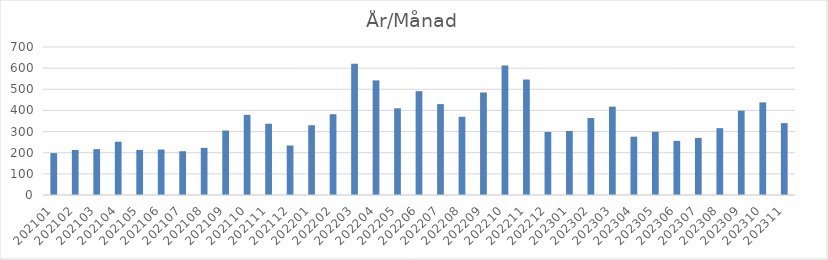
| Category | Summa |
|---|---|
| 202101 | 198 |
| 202102 | 213 |
| 202103 | 217 |
| 202104 | 252 |
| 202105 | 213 |
| 202106 | 215 |
| 202107 | 207 |
| 202108 | 223 |
| 202109 | 305 |
| 202110 | 379 |
| 202111 | 337 |
| 202112 | 234 |
| 202201 | 330 |
| 202202 | 382 |
| 202203 | 621 |
| 202204 | 542 |
| 202205 | 410 |
| 202206 | 491 |
| 202207 | 430 |
| 202208 | 370 |
| 202209 | 485 |
| 202210 | 612 |
| 202211 | 546 |
| 202212 | 298 |
| 202301 | 303 |
| 202302 | 364 |
| 202303 | 418 |
| 202304 | 276 |
| 202305 | 299 |
| 202306 | 256 |
| 202307 | 270 |
| 202308 | 316 |
| 202309 | 399 |
| 202310 | 438 |
| 202311 | 340 |